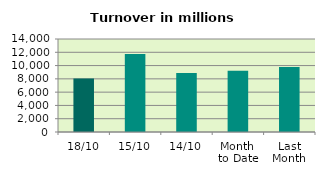
| Category | Series 0 |
|---|---|
| 18/10 | 8057.256 |
| 15/10 | 11749.772 |
| 14/10 | 8888.351 |
| Month 
to Date | 9206.408 |
| Last
Month | 9769.37 |